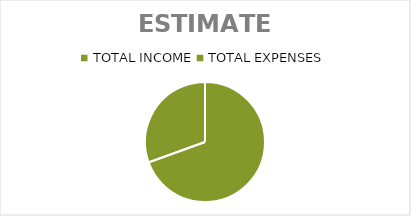
| Category | Series 0 |
|---|---|
| TOTAL INCOME | 1936 |
| TOTAL EXPENSES | 850 |